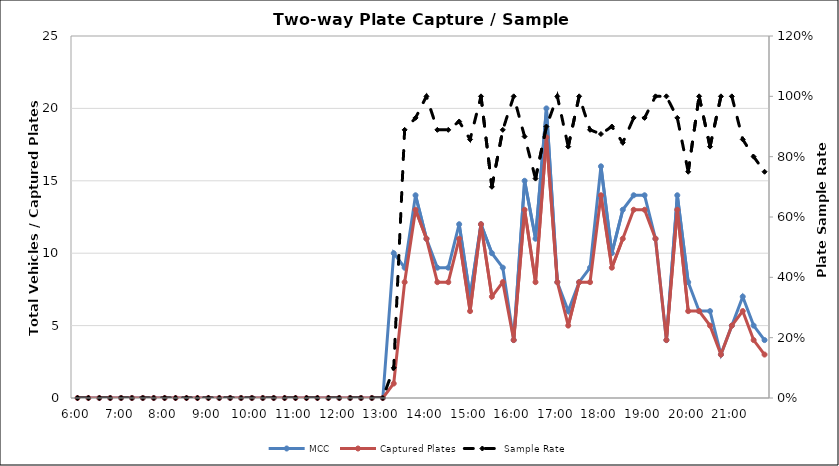
| Category | MCC | Captured Plates |
|---|---|---|
| 0.25 | 0 | 0 |
| 0.260416666666667 | 0 | 0 |
| 0.270833333333333 | 0 | 0 |
| 0.28125 | 0 | 0 |
| 0.291666666666667 | 0 | 0 |
| 0.302083333333333 | 0 | 0 |
| 0.3125 | 0 | 0 |
| 0.322916666666667 | 0 | 0 |
| 0.333333333333333 | 0 | 0 |
| 0.34375 | 0 | 0 |
| 0.354166666666667 | 0 | 0 |
| 0.364583333333333 | 0 | 0 |
| 0.375 | 0 | 0 |
| 0.385416666666667 | 0 | 0 |
| 0.395833333333333 | 0 | 0 |
| 0.40625 | 0 | 0 |
| 0.416666666666667 | 0 | 0 |
| 0.427083333333333 | 0 | 0 |
| 0.4375 | 0 | 0 |
| 0.447916666666667 | 0 | 0 |
| 0.458333333333333 | 0 | 0 |
| 0.46875 | 0 | 0 |
| 0.479166666666667 | 0 | 0 |
| 0.489583333333333 | 0 | 0 |
| 0.5 | 0 | 0 |
| 0.510416666666667 | 0 | 0 |
| 0.520833333333333 | 0 | 0 |
| 0.53125 | 0 | 0 |
| 0.541666666666667 | 0 | 0 |
| 0.552083333333333 | 10 | 1 |
| 0.5625 | 9 | 8 |
| 0.572916666666667 | 14 | 13 |
| 0.583333333333333 | 11 | 11 |
| 0.59375 | 9 | 8 |
| 0.604166666666667 | 9 | 8 |
| 0.614583333333333 | 12 | 11 |
| 0.625 | 7 | 6 |
| 0.635416666666667 | 12 | 12 |
| 0.645833333333333 | 10 | 7 |
| 0.65625 | 9 | 8 |
| 0.666666666666667 | 4 | 4 |
| 0.677083333333333 | 15 | 13 |
| 0.6875 | 11 | 8 |
| 0.697916666666667 | 20 | 18 |
| 0.708333333333333 | 8 | 8 |
| 0.71875 | 6 | 5 |
| 0.729166666666667 | 8 | 8 |
| 0.739583333333333 | 9 | 8 |
| 0.75 | 16 | 14 |
| 0.760416666666667 | 10 | 9 |
| 0.770833333333333 | 13 | 11 |
| 0.78125 | 14 | 13 |
| 0.791666666666667 | 14 | 13 |
| 0.802083333333333 | 11 | 11 |
| 0.8125 | 4 | 4 |
| 0.822916666666667 | 14 | 13 |
| 0.833333333333333 | 8 | 6 |
| 0.84375 | 6 | 6 |
| 0.854166666666667 | 6 | 5 |
| 0.864583333333333 | 3 | 3 |
| 0.875 | 5 | 5 |
| 0.885416666666667 | 7 | 6 |
| 0.895833333333333 | 5 | 4 |
| 0.90625 | 4 | 3 |